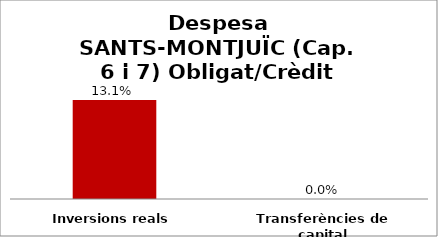
| Category | Series 0 |
|---|---|
| Inversions reals | 0.131 |
| Transferències de capital | 0 |